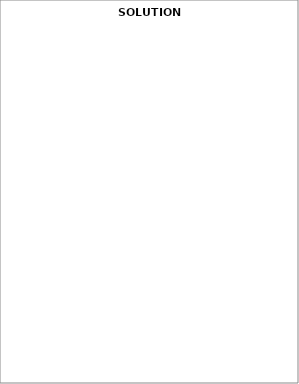
| Category | EFFECTIF |
|---|---|
| Lycée militaire | 0 |
| Apprentissage | 0 |
| CNED | 0 |
| Enseignement Agricole | 0 |
| Etablissement Justice | 0 |
| Faux décrocheurs | 0 |
| Formation initiale | 0 |
| Hors académie | 0 |
| Maison à caractère social | 0 |
| Maladie/décés | 0 |
| Mission locale | 0 |
| MLDS-DAQ | 0 |
| Privé hors contrat | 0 |
| Sans solution | 0 |
| Situation inconnue | 0 |
| Vie active | 0 |